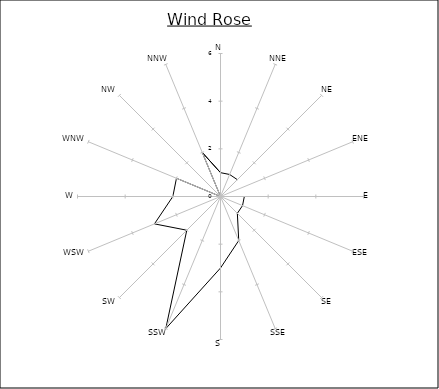
| Category | Series 0 |
|---|---|
| N | 1 |
| NNE | 1 |
| NE | 1 |
| ENE | 0 |
| E | 1 |
| ESE | 1 |
| SE | 1 |
| SSE | 2 |
| S | 3 |
| SSW | 6 |
| SW | 2 |
| WSW | 3 |
| W | 2 |
| WNW | 2 |
| NW | 0 |
| NNW | 2 |